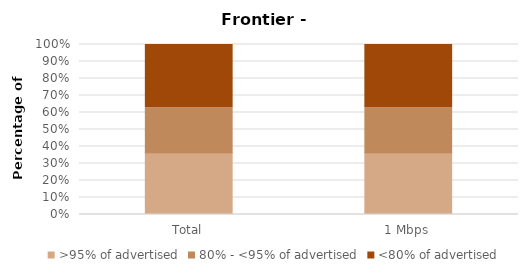
| Category | >95% of advertised | 80% - <95% of advertised | <80% of advertised |
|---|---|---|---|
| Total | 0.364 | 0.264 | 0.373 |
| 1 Mbps | 0.364 | 0.264 | 0.373 |